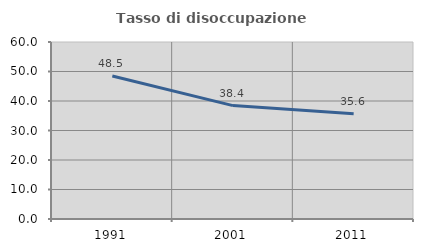
| Category | Tasso di disoccupazione giovanile  |
|---|---|
| 1991.0 | 48.497 |
| 2001.0 | 38.44 |
| 2011.0 | 35.639 |